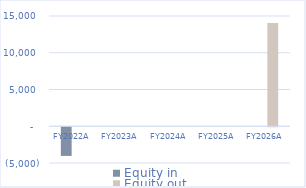
| Category | Equity in | Equity out |
|---|---|---|
| 2022.0 | -3900 | 0 |
| 2023.0 | 0 | 0 |
| 2024.0 | 0 | 0 |
| 2025.0 | 0 | 0 |
| 2026.0 | 0 | 14040.898 |